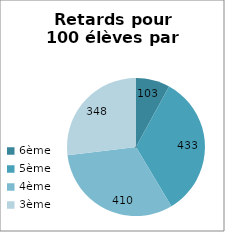
| Category | Series 0 |
|---|---|
| 6ème | 103 |
| 5ème | 433 |
| 4ème | 410 |
| 3ème | 348 |